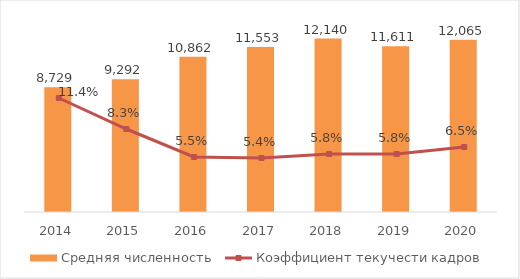
| Category | Средняя численность |
|---|---|
| 2014.0 | 8729 |
| 2015.0 | 9292 |
| 2016.0 | 10862 |
| 2017.0 | 11553 |
| 2018.0 | 12140 |
| 2019.0 | 11611 |
| 2020.0 | 12065 |